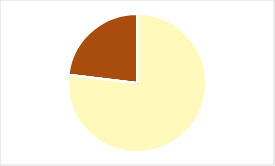
| Category | Series 0 |
|---|---|
| 0 | 0 |
| 1 | 0.769 |
| 2 | 0 |
| 3 | 0 |
| 4 | 0.231 |